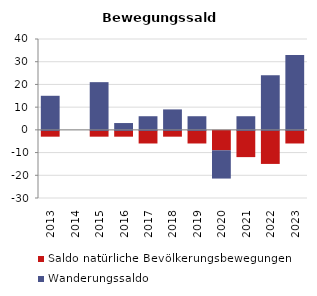
| Category | Saldo natürliche Bevölkerungsbewegungen | Wanderungssaldo |
|---|---|---|
| 2013.0 | -3 | 15 |
| 2014.0 | 0 | 0 |
| 2015.0 | -3 | 21 |
| 2016.0 | -3 | 3 |
| 2017.0 | -6 | 6 |
| 2018.0 | -3 | 9 |
| 2019.0 | -6 | 6 |
| 2020.0 | -9 | -12 |
| 2021.0 | -12 | 6 |
| 2022.0 | -15 | 24 |
| 2023.0 | -6 | 33 |